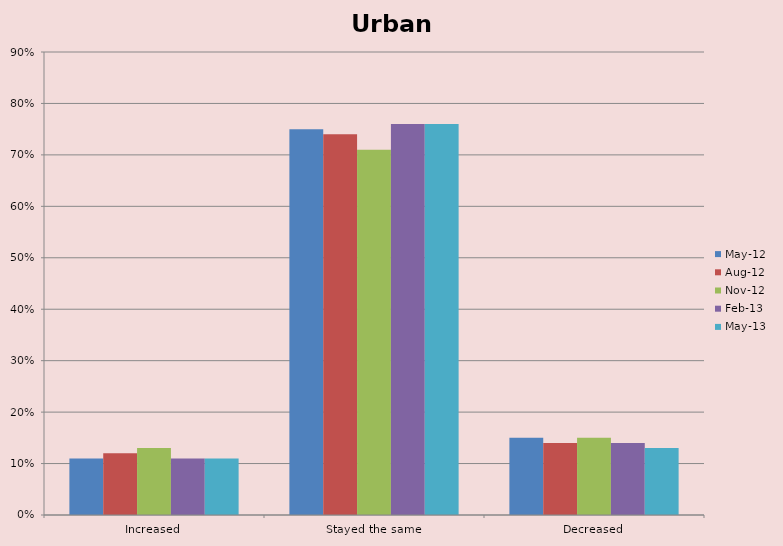
| Category | May-12 | Aug-12 | Nov-12 | Feb-13 | May-13 |
|---|---|---|---|---|---|
| Increased | 0.11 | 0.12 | 0.13 | 0.11 | 0.11 |
| Stayed the same | 0.75 | 0.74 | 0.71 | 0.76 | 0.76 |
| Decreased | 0.15 | 0.14 | 0.15 | 0.14 | 0.13 |